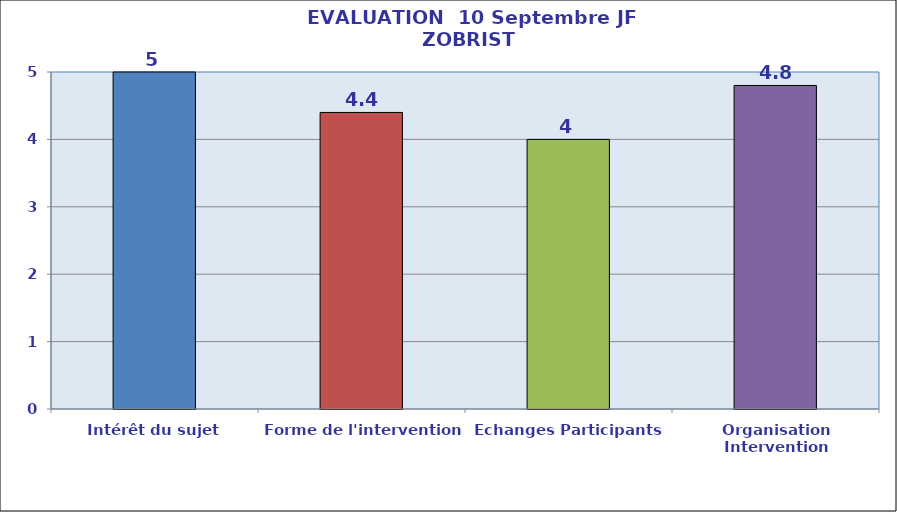
| Category | Series 0 |
|---|---|
| Intérêt du sujet | 5 |
| Forme de l'intervention | 4.4 |
| Echanges Participants | 4 |
| Organisation Intervention | 4.8 |